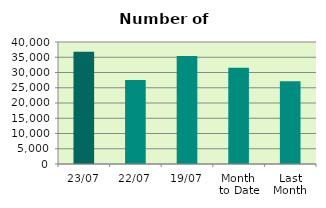
| Category | Series 0 |
|---|---|
| 23/07 | 36836 |
| 22/07 | 27524 |
| 19/07 | 35392 |
| Month 
to Date | 31588 |
| Last
Month | 27125.1 |